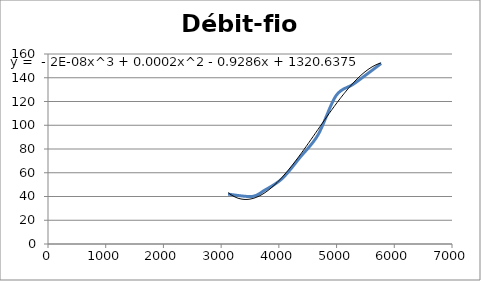
| Category | Débit-fioul |
|---|---|
| 3120.0 | 42 |
| 3536.0 | 40 |
| 3744.0 | 45 |
| 4056.0 | 55 |
| 4368.0 | 73 |
| 4680.0 | 92 |
| 4992.0 | 125 |
| 5304.0 | 135 |
| 5772.0 | 152 |